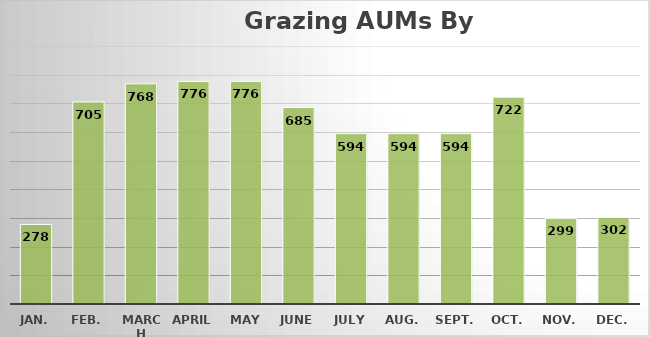
| Category | Series 0 |
|---|---|
| Jan. | 277.59 |
| Feb. | 704.9 |
| March | 768.15 |
| April | 776.4 |
| May | 776.4 |
| June | 685.4 |
| July | 594.4 |
| Aug. | 594.4 |
| Sept. | 594.4 |
| Oct. | 721.65 |
| Nov. | 299 |
| Dec. | 301.89 |